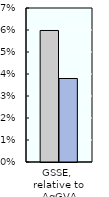
| Category | 2000-02 | 2018-20 |
|---|---|---|
| GSSE, 
relative to AgGVA | 0.06 | 0.038 |